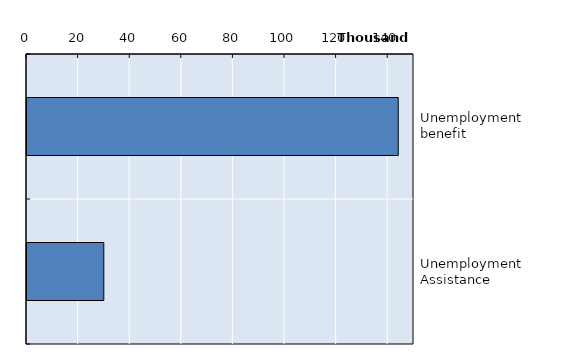
| Category | Series 0 |
|---|---|
| Unemployment benefit | 143884 |
| Unemployment Assistance | 29767 |